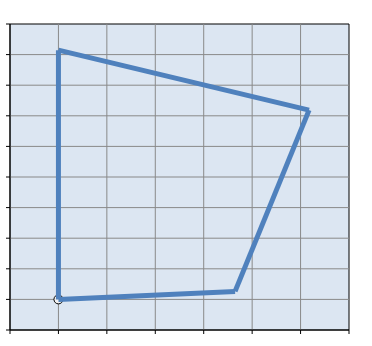
| Category | Series 0 |
|---|---|
| 999.9999999999999 | 2000 |
| 1072.9537934014581 | 2005.236 |
| 1103.5036159880387 | 2123.705 |
| 1000.0005251620188 | 2162.901 |
| 999.9999999999999 | 2000 |
| 999.9999999999999 | 2000 |
| 999.9999999999999 | 2000 |
| 999.9999999999999 | 2000 |
| 999.9999999999999 | 2000 |
| 999.9999999999999 | 2000 |
| 999.9999999999999 | 2000 |
| 999.9999999999999 | 2000 |
| 999.9999999999999 | 2000 |
| 999.9999999999999 | 2000 |
| 999.9999999999999 | 2000 |
| 999.9999999999999 | 2000 |
| 999.9999999999999 | 2000 |
| 999.9999999999999 | 2000 |
| 999.9999999999999 | 2000 |
| 999.9999999999999 | 2000 |
| 999.9999999999999 | 2000 |
| 999.9999999999999 | 2000 |
| 999.9999999999999 | 2000 |
| 999.9999999999999 | 2000 |
| 999.9999999999999 | 2000 |
| 999.9999999999999 | 2000 |
| 999.9999999999999 | 2000 |
| 999.9999999999999 | 2000 |
| 999.9999999999999 | 2000 |
| 999.9999999999999 | 2000 |
| 999.9999999999999 | 2000 |
| 999.9999999999999 | 2000 |
| 999.9999999999999 | 2000 |
| 999.9999999999999 | 2000 |
| 999.9999999999999 | 2000 |
| 999.9999999999999 | 2000 |
| 999.9999999999999 | 2000 |
| 999.9999999999999 | 2000 |
| 999.9999999999999 | 2000 |
| 999.9999999999999 | 2000 |
| 999.9999999999999 | 2000 |
| 999.9999999999999 | 2000 |
| 999.9999999999999 | 2000 |
| 999.9999999999999 | 2000 |
| 999.9999999999999 | 2000 |
| 999.9999999999999 | 2000 |
| 999.9999999999999 | 2000 |
| 999.9999999999999 | 2000 |
| 999.9999999999999 | 2000 |
| 999.9999999999999 | 2000 |
| 999.9999999999999 | 2000 |
| 999.9999999999999 | 2000 |
| 999.9999999999999 | 2000 |
| 999.9999999999999 | 2000 |
| 999.9999999999999 | 2000 |
| 999.9999999999999 | 2000 |
| 999.9999999999999 | 2000 |
| 999.9999999999999 | 2000 |
| 999.9999999999999 | 2000 |
| 999.9999999999999 | 2000 |
| 999.9999999999999 | 2000 |
| 999.9999999999999 | 2000 |
| 999.9999999999999 | 2000 |
| 999.9999999999999 | 2000 |
| 999.9999999999999 | 2000 |
| 999.9999999999999 | 2000 |
| 999.9999999999999 | 2000 |
| 999.9999999999999 | 2000 |
| 999.9999999999999 | 2000 |
| 999.9999999999999 | 2000 |
| 999.9999999999999 | 2000 |
| 999.9999999999999 | 2000 |
| 999.9999999999999 | 2000 |
| 999.9999999999999 | 2000 |
| 999.9999999999999 | 2000 |
| 999.9999999999999 | 2000 |
| 999.9999999999999 | 2000 |
| 999.9999999999999 | 2000 |
| 999.9999999999999 | 2000 |
| 999.9999999999999 | 2000 |
| 999.9999999999999 | 2000 |
| 999.9999999999999 | 2000 |
| 999.9999999999999 | 2000 |
| 999.9999999999999 | 2000 |
| 999.9999999999999 | 2000 |
| 999.9999999999999 | 2000 |
| 999.9999999999999 | 2000 |
| 999.9999999999999 | 2000 |
| 999.9999999999999 | 2000 |
| 999.9999999999999 | 2000 |
| 999.9999999999999 | 2000 |
| 999.9999999999999 | 2000 |
| 999.9999999999999 | 2000 |
| 999.9999999999999 | 2000 |
| 999.9999999999999 | 2000 |
| 999.9999999999999 | 2000 |
| 999.9999999999999 | 2000 |
| 999.9999999999999 | 2000 |
| 999.9999999999999 | 2000 |
| 999.9999999999999 | 2000 |